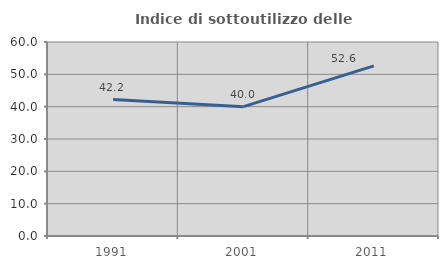
| Category | Indice di sottoutilizzo delle abitazioni  |
|---|---|
| 1991.0 | 42.199 |
| 2001.0 | 40 |
| 2011.0 | 52.632 |